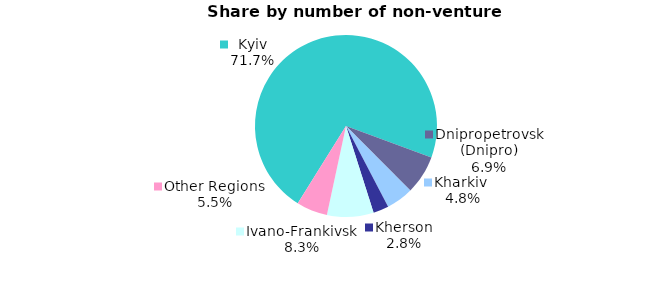
| Category | Series 0 |
|---|---|
| Kyiv | 0.717 |
| Dnipropetrovsk (Dnipro) | 0.069 |
| Kharkiv  | 0.048 |
| Kherson | 0.028 |
| Ivano-Frankivsk | 0.083 |
| Other Regions | 0.055 |